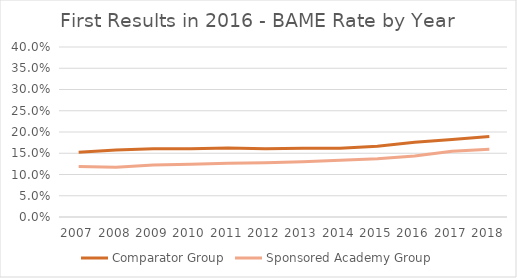
| Category | Comparator Group | Sponsored Academy Group |
|---|---|---|
| 2007.0 | 0.152 | 0.119 |
| 2008.0 | 0.158 | 0.117 |
| 2009.0 | 0.16 | 0.122 |
| 2010.0 | 0.16 | 0.124 |
| 2011.0 | 0.163 | 0.126 |
| 2012.0 | 0.161 | 0.127 |
| 2013.0 | 0.162 | 0.13 |
| 2014.0 | 0.162 | 0.133 |
| 2015.0 | 0.167 | 0.137 |
| 2016.0 | 0.176 | 0.143 |
| 2017.0 | 0.182 | 0.155 |
| 2018.0 | 0.19 | 0.159 |